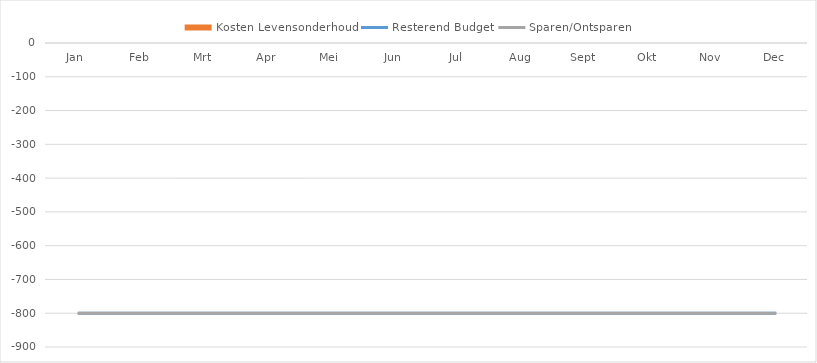
| Category | Kosten Levensonderhoud |
|---|---|
| Jan | 0 |
| Feb | 0 |
| Mrt | 0 |
| Apr | 0 |
| Mei | 0 |
| Jun | 0 |
| Jul | 0 |
| Aug | 0 |
| Sept | 0 |
| Okt | 0 |
| Nov | 0 |
| Dec | 0 |